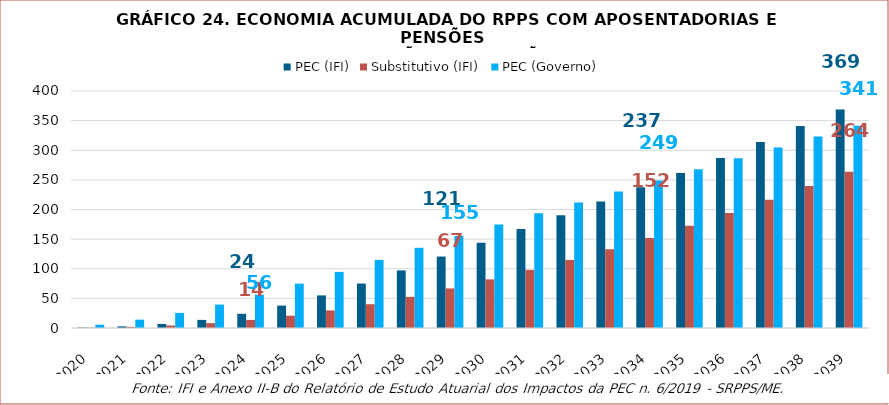
| Category | PEC (IFI) | Substitutivo (IFI) | PEC (Governo) |
|---|---|---|---|
| 2020.0 | 793722235.262 | 583857905.115 | 5473057161 |
| 2021.0 | 2776990655.553 | 1868853284.478 | 14086554336 |
| 2022.0 | 6837250513.374 | 4328909545.891 | 25490991890 |
| 2023.0 | 13694160753.702 | 8192072356.912 | 39499573532 |
| 2024.0 | 23942579735.338 | 13679079769.865 | 56272327426 |
| 2025.0 | 37821060239.266 | 20799389740.326 | 74883622055 |
| 2026.0 | 55060044102.447 | 29646706949.591 | 94673393525 |
| 2027.0 | 75052827549.044 | 40168660119.697 | 114972760145 |
| 2028.0 | 97221550900.505 | 52602679407.288 | 135337704063 |
| 2029.0 | 120577101831.081 | 66819422960.656 | 155372888066 |
| 2030.0 | 144027226650.322 | 82049974184.822 | 174744479622 |
| 2031.0 | 167243381222.856 | 98023543439.322 | 193469956251 |
| 2032.0 | 190345420694.722 | 114896284271.982 | 211977702769 |
| 2033.0 | 213669117266.915 | 132875228185.87 | 230495029721 |
| 2034.0 | 237419352985.874 | 152052017611.582 | 249134319064 |
| 2035.0 | 261676646286.043 | 172456705153.825 | 267726096479 |
| 2036.0 | 287092084846.783 | 193976169800.649 | 286328878836 |
| 2037.0 | 313733843756.123 | 216443552272.685 | 304817816055 |
| 2038.0 | 341027223293.179 | 239769309538.786 | 323111695335 |
| 2039.0 | 368665363745.292 | 263804022550.585 | 341282878991 |